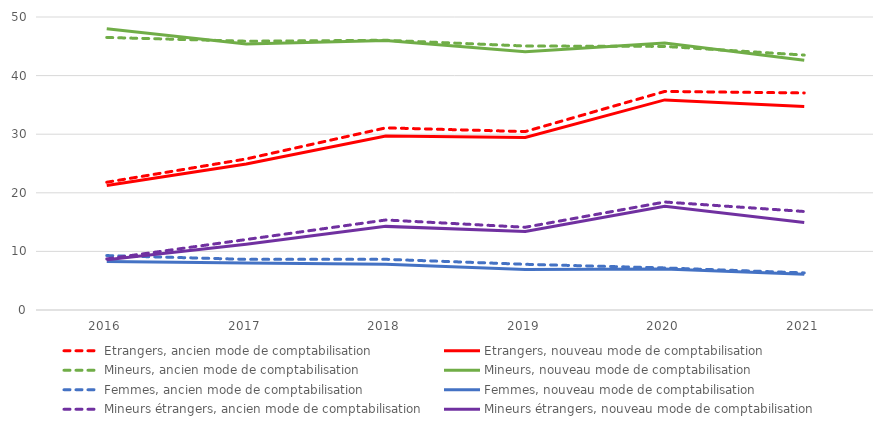
| Category | Etrangers, ancien mode de comptabilisation | Etrangers, nouveau mode de comptabilisation | Mineurs, ancien mode de comptabilisation | Mineurs, nouveau mode de comptabilisation | Femmes, ancien mode de comptabilisation | Femmes, nouveau mode de comptabilisation | Mineurs étrangers, ancien mode de comptabilisation | Mineurs étrangers, nouveau mode de comptabilisation |
|---|---|---|---|---|---|---|---|---|
| 2016.0 | 21.8 | 21.23 | 46.51 | 48.01 | 9.29 | 8.26 | 8.72 | 8.57 |
| 2017.0 | 25.78 | 24.9 | 45.87 | 45.38 | 8.64 | 8.01 | 12.03 | 11.21 |
| 2018.0 | 31.08 | 29.69 | 46.03 | 45.97 | 8.65 | 7.82 | 15.36 | 14.27 |
| 2019.0 | 30.45 | 29.44 | 45.05 | 44.09 | 7.8 | 6.93 | 14.12 | 13.38 |
| 2020.0 | 37.3 | 35.85 | 44.98 | 45.55 | 7.18 | 6.99 | 18.43 | 17.69 |
| 2021.0 | 37.04 | 34.71 | 43.5 | 42.61 | 6.33 | 6.09 | 16.81 | 14.92 |